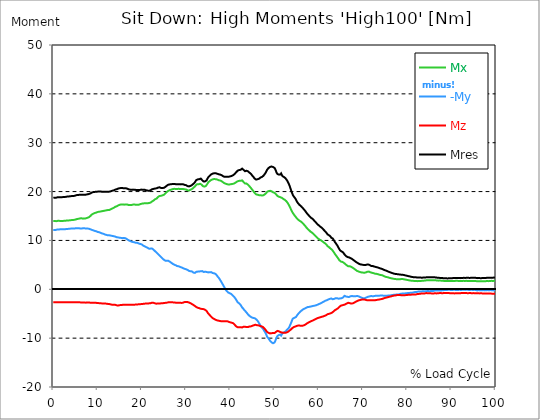
| Category |  Mx |  -My |  Mz |  Mres |
|---|---|---|---|---|
| 0.0 | 13.964 | 12.114 | -2.674 | 18.715 |
| 0.167348456675344 | 13.964 | 12.114 | -2.653 | 18.736 |
| 0.334696913350688 | 13.964 | 12.114 | -2.674 | 18.736 |
| 0.5020453700260321 | 13.964 | 12.134 | -2.674 | 18.736 |
| 0.669393826701376 | 13.944 | 12.175 | -2.674 | 18.756 |
| 0.83674228337672 | 13.964 | 12.216 | -2.674 | 18.798 |
| 1.0040907400520642 | 14.006 | 12.257 | -2.674 | 18.859 |
| 1.1621420602454444 | 14.026 | 12.257 | -2.674 | 18.859 |
| 1.3294905169207885 | 14.006 | 12.257 | -2.674 | 18.859 |
| 1.4968389735961325 | 14.006 | 12.257 | -2.674 | 18.859 |
| 1.6641874302714765 | 13.985 | 12.278 | -2.674 | 18.859 |
| 1.8315358869468206 | 13.985 | 12.278 | -2.653 | 18.859 |
| 1.9988843436221646 | 13.985 | 12.278 | -2.653 | 18.859 |
| 2.1662328002975086 | 14.006 | 12.278 | -2.674 | 18.88 |
| 2.333581256972853 | 14.006 | 12.299 | -2.653 | 18.88 |
| 2.5009297136481967 | 14.026 | 12.278 | -2.653 | 18.88 |
| 2.6682781703235405 | 14.026 | 12.299 | -2.653 | 18.9 |
| 2.8356266269988843 | 14.047 | 12.34 | -2.653 | 18.942 |
| 3.002975083674229 | 14.067 | 12.34 | -2.653 | 18.962 |
| 3.1703235403495724 | 14.088 | 12.34 | -2.653 | 18.962 |
| 3.337671997024917 | 14.088 | 12.36 | -2.653 | 18.983 |
| 3.4957233172182973 | 14.108 | 12.381 | -2.653 | 19.003 |
| 3.663071773893641 | 14.108 | 12.401 | -2.653 | 19.024 |
| 3.8304202305689854 | 14.129 | 12.401 | -2.653 | 19.044 |
| 3.997768687244329 | 14.15 | 12.422 | -2.653 | 19.065 |
| 4.165117143919673 | 14.191 | 12.401 | -2.653 | 19.085 |
| 4.332465600595017 | 14.191 | 12.422 | -2.653 | 19.085 |
| 4.499814057270361 | 14.191 | 12.422 | -2.653 | 19.106 |
| 4.667162513945706 | 14.211 | 12.422 | -2.674 | 19.106 |
| 4.834510970621049 | 14.232 | 12.443 | -2.674 | 19.147 |
| 5.001859427296393 | 14.273 | 12.484 | -2.674 | 19.188 |
| 5.169207883971737 | 14.335 | 12.504 | -2.674 | 19.25 |
| 5.336556340647081 | 14.376 | 12.484 | -2.674 | 19.291 |
| 5.503904797322425 | 14.417 | 12.463 | -2.674 | 19.291 |
| 5.671253253997769 | 14.438 | 12.484 | -2.674 | 19.312 |
| 5.82930457419115 | 14.479 | 12.484 | -2.653 | 19.332 |
| 5.996653030866494 | 14.499 | 12.463 | -2.674 | 19.353 |
| 6.164001487541838 | 14.54 | 12.443 | -2.674 | 19.353 |
| 6.331349944217181 | 14.54 | 12.422 | -2.694 | 19.353 |
| 6.498698400892526 | 14.52 | 12.443 | -2.694 | 19.353 |
| 6.66604685756787 | 14.458 | 12.484 | -2.694 | 19.353 |
| 6.833395314243213 | 14.458 | 12.525 | -2.694 | 19.373 |
| 7.000743770918558 | 14.479 | 12.484 | -2.715 | 19.353 |
| 7.168092227593902 | 14.499 | 12.443 | -2.735 | 19.353 |
| 7.335440684269246 | 14.52 | 12.443 | -2.735 | 19.373 |
| 7.50278914094459 | 14.561 | 12.463 | -2.715 | 19.415 |
| 7.6701375976199335 | 14.623 | 12.443 | -2.715 | 19.435 |
| 7.837486054295278 | 14.664 | 12.422 | -2.715 | 19.456 |
| 7.995537374488658 | 14.725 | 12.401 | -2.715 | 19.497 |
| 8.162885831164003 | 14.828 | 12.36 | -2.735 | 19.538 |
| 8.330234287839346 | 14.972 | 12.299 | -2.735 | 19.6 |
| 8.49758274451469 | 15.157 | 12.216 | -2.756 | 19.702 |
| 8.664931201190035 | 15.281 | 12.175 | -2.756 | 19.785 |
| 8.832279657865378 | 15.342 | 12.134 | -2.756 | 19.826 |
| 8.999628114540721 | 15.466 | 12.072 | -2.756 | 19.888 |
| 9.166976571216066 | 15.569 | 11.99 | -2.776 | 19.908 |
| 9.334325027891412 | 15.61 | 11.949 | -2.776 | 19.929 |
| 9.501673484566755 | 15.651 | 11.928 | -2.776 | 19.949 |
| 9.669021941242098 | 15.692 | 11.887 | -2.776 | 19.97 |
| 9.836370397917442 | 15.774 | 11.784 | -2.818 | 19.99 |
| 10.003718854592787 | 15.815 | 11.743 | -2.818 | 19.99 |
| 10.17106731126813 | 15.857 | 11.723 | -2.838 | 20.011 |
| 10.329118631461512 | 15.877 | 11.682 | -2.838 | 20.032 |
| 10.496467088136853 | 15.918 | 11.599 | -2.859 | 20.011 |
| 10.663815544812199 | 15.918 | 11.558 | -2.859 | 20.011 |
| 10.831164001487544 | 15.939 | 11.497 | -2.879 | 19.99 |
| 10.998512458162887 | 15.98 | 11.435 | -2.9 | 19.97 |
| 11.16586091483823 | 16.001 | 11.394 | -2.9 | 19.97 |
| 11.333209371513574 | 16.042 | 11.353 | -2.9 | 19.97 |
| 11.50055782818892 | 16.083 | 11.291 | -2.9 | 19.97 |
| 11.667906284864264 | 16.103 | 11.209 | -2.92 | 19.949 |
| 11.835254741539607 | 16.124 | 11.167 | -2.92 | 19.949 |
| 12.00260319821495 | 16.165 | 11.126 | -2.941 | 19.949 |
| 12.169951654890292 | 16.165 | 11.106 | -2.962 | 19.949 |
| 12.337300111565641 | 16.227 | 11.044 | -3.003 | 19.97 |
| 12.504648568240984 | 16.206 | 11.065 | -3.003 | 19.97 |
| 12.662699888434362 | 16.247 | 11.044 | -3.023 | 19.99 |
| 12.830048345109708 | 16.309 | 10.982 | -3.064 | 20.011 |
| 12.997396801785053 | 16.391 | 10.982 | -3.106 | 20.073 |
| 13.164745258460396 | 16.494 | 10.921 | -3.167 | 20.134 |
| 13.33209371513574 | 16.535 | 10.921 | -3.167 | 20.176 |
| 13.499442171811083 | 16.576 | 10.9 | -3.188 | 20.196 |
| 13.666790628486426 | 16.679 | 10.859 | -3.188 | 20.258 |
| 13.834139085161771 | 16.782 | 10.859 | -3.167 | 20.361 |
| 14.001487541837117 | 16.885 | 10.777 | -3.188 | 20.402 |
| 14.16883599851246 | 16.947 | 10.694 | -3.249 | 20.443 |
| 14.336184455187803 | 16.988 | 10.653 | -3.291 | 20.484 |
| 14.503532911863147 | 17.07 | 10.633 | -3.311 | 20.546 |
| 14.670881368538492 | 17.173 | 10.612 | -3.311 | 20.628 |
| 14.828932688731873 | 17.235 | 10.571 | -3.27 | 20.669 |
| 14.996281145407215 | 17.296 | 10.55 | -3.249 | 20.69 |
| 15.163629602082558 | 17.337 | 10.55 | -3.208 | 20.731 |
| 15.330978058757903 | 17.378 | 10.509 | -3.208 | 20.731 |
| 15.498326515433247 | 17.378 | 10.489 | -3.208 | 20.71 |
| 15.665674972108594 | 17.378 | 10.468 | -3.188 | 20.71 |
| 15.833023428783937 | 17.358 | 10.468 | -3.167 | 20.69 |
| 16.00037188545928 | 17.317 | 10.489 | -3.147 | 20.669 |
| 16.167720342134626 | 17.317 | 10.468 | -3.147 | 20.669 |
| 16.335068798809967 | 17.378 | 10.448 | -3.167 | 20.69 |
| 16.502417255485312 | 17.378 | 10.345 | -3.167 | 20.649 |
| 16.669765712160658 | 17.358 | 10.242 | -3.167 | 20.607 |
| 16.837114168836 | 17.296 | 10.119 | -3.167 | 20.525 |
| 17.004462625511344 | 17.255 | 10.036 | -3.167 | 20.463 |
| 17.16251394570472 | 17.214 | 9.934 | -3.167 | 20.402 |
| 17.32986240238007 | 17.235 | 9.892 | -3.147 | 20.402 |
| 17.497210859055414 | 17.255 | 9.81 | -3.147 | 20.381 |
| 17.664559315730756 | 17.255 | 9.748 | -3.147 | 20.361 |
| 17.8319077724061 | 17.317 | 9.687 | -3.147 | 20.381 |
| 17.999256229081443 | 17.337 | 9.666 | -3.147 | 20.402 |
| 18.166604685756788 | 17.337 | 9.625 | -3.147 | 20.402 |
| 18.333953142432133 | 17.337 | 9.625 | -3.147 | 20.381 |
| 18.501301599107478 | 17.317 | 9.584 | -3.126 | 20.361 |
| 18.668650055782823 | 17.317 | 9.502 | -3.126 | 20.34 |
| 18.835998512458165 | 17.296 | 9.502 | -3.126 | 20.319 |
| 19.00334696913351 | 17.296 | 9.502 | -3.106 | 20.299 |
| 19.170695425808855 | 17.276 | 9.481 | -3.085 | 20.278 |
| 19.338043882484197 | 17.317 | 9.358 | -3.064 | 20.299 |
| 19.496095202677576 | 17.378 | 9.296 | -3.044 | 20.319 |
| 19.66344365935292 | 17.44 | 9.275 | -3.044 | 20.361 |
| 19.830792116028263 | 17.481 | 9.255 | -3.044 | 20.381 |
| 19.998140572703612 | 17.522 | 9.173 | -3.023 | 20.402 |
| 20.165489029378953 | 17.543 | 9.07 | -3.003 | 20.381 |
| 20.3328374860543 | 17.564 | 8.926 | -2.982 | 20.361 |
| 20.500185942729644 | 17.605 | 8.843 | -2.982 | 20.361 |
| 20.667534399404985 | 17.625 | 8.782 | -2.941 | 20.361 |
| 20.83488285608033 | 17.584 | 8.72 | -2.92 | 20.299 |
| 21.002231312755672 | 17.605 | 8.617 | -2.9 | 20.258 |
| 21.16957976943102 | 17.584 | 8.556 | -2.9 | 20.217 |
| 21.336928226106362 | 17.605 | 8.473 | -2.9 | 20.196 |
| 21.504276682781704 | 17.646 | 8.37 | -2.9 | 20.176 |
| 21.67162513945705 | 17.666 | 8.288 | -2.879 | 20.176 |
| 21.82967645965043 | 17.708 | 8.206 | -2.879 | 20.176 |
| 21.997024916325774 | 17.749 | 8.329 | -2.838 | 20.278 |
| 22.16437337300112 | 17.872 | 8.391 | -2.776 | 20.402 |
| 22.33172182967646 | 17.995 | 8.329 | -2.735 | 20.484 |
| 22.499070286351806 | 18.078 | 8.227 | -2.735 | 20.505 |
| 22.666418743027148 | 18.181 | 8.083 | -2.776 | 20.546 |
| 22.833767199702496 | 18.304 | 7.939 | -2.838 | 20.587 |
| 23.00111565637784 | 18.427 | 7.795 | -2.879 | 20.628 |
| 23.168464113053183 | 18.489 | 7.651 | -2.92 | 20.649 |
| 23.335812569728528 | 18.571 | 7.527 | -2.941 | 20.669 |
| 23.50316102640387 | 18.695 | 7.383 | -2.92 | 20.71 |
| 23.670509483079215 | 18.88 | 7.219 | -2.92 | 20.813 |
| 23.83785793975456 | 19.044 | 7.075 | -2.92 | 20.875 |
| 23.995909259947936 | 19.106 | 6.931 | -2.9 | 20.875 |
| 24.163257716623285 | 19.106 | 6.787 | -2.879 | 20.813 |
| 24.330606173298627 | 19.127 | 6.602 | -2.879 | 20.751 |
| 24.49795462997397 | 19.188 | 6.458 | -2.859 | 20.751 |
| 24.665303086649313 | 19.229 | 6.293 | -2.859 | 20.731 |
| 24.83265154332466 | 19.291 | 6.17 | -2.838 | 20.731 |
| 25.0 | 19.353 | 6.046 | -2.818 | 20.772 |
| 25.167348456675345 | 19.476 | 5.944 | -2.797 | 20.854 |
| 25.334696913350694 | 19.62 | 5.841 | -2.776 | 20.957 |
| 25.502045370026035 | 19.764 | 5.759 | -2.776 | 21.08 |
| 25.669393826701377 | 19.929 | 5.82 | -2.735 | 21.224 |
| 25.836742283376722 | 20.052 | 5.82 | -2.715 | 21.327 |
| 26.004090740052067 | 20.155 | 5.82 | -2.674 | 21.409 |
| 26.17143919672741 | 20.237 | 5.779 | -2.653 | 21.471 |
| 26.329490516920792 | 20.299 | 5.656 | -2.653 | 21.471 |
| 26.49683897359613 | 20.34 | 5.491 | -2.653 | 21.492 |
| 26.66418743027148 | 20.402 | 5.429 | -2.653 | 21.512 |
| 26.831535886946828 | 20.463 | 5.306 | -2.653 | 21.533 |
| 26.998884343622166 | 20.505 | 5.203 | -2.674 | 21.553 |
| 27.166232800297514 | 20.525 | 5.121 | -2.694 | 21.553 |
| 27.333581256972852 | 20.566 | 5.039 | -2.715 | 21.574 |
| 27.5009297136482 | 20.546 | 4.977 | -2.735 | 21.533 |
| 27.668278170323543 | 20.525 | 4.915 | -2.735 | 21.512 |
| 27.835626626998888 | 20.505 | 4.792 | -2.735 | 21.471 |
| 28.002975083674233 | 20.525 | 4.751 | -2.756 | 21.492 |
| 28.170323540349575 | 20.525 | 4.71 | -2.756 | 21.492 |
| 28.33767199702492 | 20.566 | 4.71 | -2.735 | 21.512 |
| 28.50502045370026 | 20.566 | 4.648 | -2.735 | 21.512 |
| 28.663071773893645 | 20.505 | 4.566 | -2.735 | 21.471 |
| 28.830420230568986 | 20.505 | 4.504 | -2.776 | 21.471 |
| 28.99776868724433 | 20.525 | 4.463 | -2.797 | 21.492 |
| 29.165117143919673 | 20.525 | 4.381 | -2.776 | 21.492 |
| 29.33246560059502 | 20.525 | 4.319 | -2.735 | 21.492 |
| 29.499814057270367 | 20.505 | 4.237 | -2.674 | 21.43 |
| 29.66716251394571 | 20.463 | 4.196 | -2.612 | 21.368 |
| 29.834510970621054 | 20.463 | 4.154 | -2.591 | 21.368 |
| 30.00185942729639 | 20.422 | 4.093 | -2.591 | 21.307 |
| 30.169207883971744 | 20.34 | 4.031 | -2.612 | 21.224 |
| 30.33655634064708 | 20.258 | 3.969 | -2.612 | 21.122 |
| 30.50390479732243 | 20.258 | 3.825 | -2.674 | 21.101 |
| 30.671253253997772 | 20.217 | 3.764 | -2.715 | 21.06 |
| 30.829304574191156 | 20.258 | 3.702 | -2.776 | 21.08 |
| 30.996653030866494 | 20.361 | 3.681 | -2.838 | 21.163 |
| 31.164001487541842 | 20.402 | 3.722 | -2.941 | 21.204 |
| 31.331349944217187 | 20.505 | 3.661 | -3.023 | 21.327 |
| 31.498698400892525 | 20.649 | 3.579 | -3.106 | 21.471 |
| 31.666046857567874 | 20.772 | 3.414 | -3.208 | 21.595 |
| 31.833395314243212 | 20.895 | 3.311 | -3.311 | 21.739 |
| 32.00074377091856 | 21.039 | 3.352 | -3.414 | 21.903 |
| 32.1680922275939 | 21.245 | 3.476 | -3.517 | 22.15 |
| 32.33544068426925 | 21.43 | 3.579 | -3.64 | 22.376 |
| 32.50278914094459 | 21.512 | 3.579 | -3.722 | 22.458 |
| 32.670137597619934 | 21.533 | 3.62 | -3.784 | 22.499 |
| 32.83748605429528 | 21.492 | 3.661 | -3.825 | 22.479 |
| 33.004834510970625 | 21.533 | 3.64 | -3.866 | 22.541 |
| 33.162885831164004 | 21.595 | 3.62 | -3.928 | 22.623 |
| 33.33023428783935 | 21.615 | 3.702 | -3.99 | 22.664 |
| 33.497582744514695 | 21.43 | 3.722 | -4.01 | 22.499 |
| 33.664931201190036 | 21.245 | 3.722 | -4.031 | 22.314 |
| 33.83227965786538 | 21.101 | 3.661 | -4.031 | 22.15 |
| 33.99962811454073 | 21.019 | 3.537 | -4.072 | 22.047 |
| 34.16697657121607 | 21.019 | 3.496 | -4.134 | 22.026 |
| 34.33432502789141 | 21.08 | 3.599 | -4.216 | 22.088 |
| 34.50167348456676 | 21.163 | 3.62 | -4.319 | 22.17 |
| 34.6690219412421 | 21.307 | 3.537 | -4.463 | 22.314 |
| 34.83637039791744 | 21.595 | 3.476 | -4.71 | 22.623 |
| 35.00371885459279 | 21.883 | 3.455 | -4.936 | 22.911 |
| 35.17106731126814 | 22.026 | 3.476 | -5.1 | 23.096 |
| 35.338415767943474 | 22.129 | 3.496 | -5.265 | 23.219 |
| 35.49646708813686 | 22.232 | 3.496 | -5.429 | 23.343 |
| 35.6638155448122 | 22.356 | 3.517 | -5.594 | 23.507 |
| 35.831164001487544 | 22.458 | 3.414 | -5.759 | 23.61 |
| 35.998512458162885 | 22.499 | 3.332 | -5.882 | 23.672 |
| 36.165860914838234 | 22.561 | 3.311 | -5.985 | 23.733 |
| 36.333209371513576 | 22.561 | 3.27 | -6.067 | 23.754 |
| 36.50055782818892 | 22.561 | 3.249 | -6.149 | 23.775 |
| 36.667906284864266 | 22.541 | 3.147 | -6.232 | 23.754 |
| 36.83525474153961 | 22.52 | 3.003 | -6.314 | 23.733 |
| 37.002603198214956 | 22.479 | 2.797 | -6.355 | 23.672 |
| 37.1699516548903 | 22.397 | 2.591 | -6.396 | 23.59 |
| 37.337300111565646 | 22.335 | 2.427 | -6.417 | 23.548 |
| 37.50464856824098 | 22.314 | 2.221 | -6.458 | 23.507 |
| 37.66269988843437 | 22.273 | 1.974 | -6.499 | 23.487 |
| 37.83004834510971 | 22.232 | 1.728 | -6.52 | 23.446 |
| 37.99739680178505 | 22.15 | 1.481 | -6.54 | 23.384 |
| 38.16474525846039 | 22.068 | 1.213 | -6.54 | 23.302 |
| 38.33209371513574 | 21.924 | 0.946 | -6.54 | 23.178 |
| 38.49944217181109 | 21.8 | 0.679 | -6.54 | 23.075 |
| 38.666790628486424 | 21.718 | 0.411 | -6.561 | 23.014 |
| 38.83413908516178 | 21.656 | 0.144 | -6.54 | 23.014 |
| 39.001487541837115 | 21.595 | -0.123 | -6.52 | 23.014 |
| 39.16883599851246 | 21.533 | -0.329 | -6.52 | 23.014 |
| 39.336184455187805 | 21.492 | -0.514 | -6.54 | 23.014 |
| 39.503532911863154 | 21.43 | -0.638 | -6.581 | 23.014 |
| 39.670881368538495 | 21.43 | -0.74 | -6.663 | 23.034 |
| 39.83822982521384 | 21.451 | -0.802 | -6.725 | 23.075 |
| 39.996281145407224 | 21.492 | -0.843 | -6.766 | 23.116 |
| 40.163629602082565 | 21.512 | -0.925 | -6.807 | 23.158 |
| 40.33097805875791 | 21.533 | -1.049 | -6.849 | 23.199 |
| 40.498326515433256 | 21.574 | -1.213 | -6.951 | 23.281 |
| 40.6656749721086 | 21.595 | -1.357 | -6.951 | 23.363 |
| 40.83302342878393 | 21.656 | -1.501 | -7.095 | 23.487 |
| 41.00037188545929 | 21.718 | -1.645 | -7.26 | 23.61 |
| 41.16772034213463 | 21.8 | -1.892 | -7.424 | 23.775 |
| 41.33506879880997 | 21.924 | -2.159 | -7.589 | 23.96 |
| 41.50241725548531 | 22.047 | -2.386 | -7.733 | 24.145 |
| 41.66976571216066 | 22.109 | -2.653 | -7.774 | 24.268 |
| 41.837114168836 | 22.17 | -2.776 | -7.774 | 24.35 |
| 42.004462625511344 | 22.191 | -2.879 | -7.774 | 24.412 |
| 42.17181108218669 | 22.191 | -3.023 | -7.753 | 24.412 |
| 42.32986240238007 | 22.191 | -3.188 | -7.753 | 24.453 |
| 42.497210859055414 | 22.273 | -3.455 | -7.795 | 24.597 |
| 42.66455931573076 | 22.294 | -3.702 | -7.815 | 24.7 |
| 42.831907772406105 | 22.109 | -3.846 | -7.692 | 24.577 |
| 42.999256229081446 | 21.965 | -4.031 | -7.651 | 24.453 |
| 43.16660468575679 | 21.821 | -4.257 | -7.651 | 24.309 |
| 43.33395314243214 | 21.656 | -4.442 | -7.671 | 24.165 |
| 43.50130159910748 | 21.656 | -4.566 | -7.712 | 24.227 |
| 43.66865005578282 | 21.636 | -4.73 | -7.733 | 24.268 |
| 43.83599851245817 | 21.533 | -4.936 | -7.733 | 24.227 |
| 44.00334696913351 | 21.409 | -5.142 | -7.733 | 24.145 |
| 44.17069542580886 | 21.286 | -5.306 | -7.671 | 24.042 |
| 44.3380438824842 | 21.08 | -5.429 | -7.61 | 23.877 |
| 44.49609520267758 | 20.916 | -5.573 | -7.589 | 23.775 |
| 44.66344365935292 | 20.751 | -5.656 | -7.589 | 23.631 |
| 44.83079211602827 | 20.525 | -5.8 | -7.548 | 23.446 |
| 44.99814057270361 | 20.34 | -5.82 | -7.466 | 23.24 |
| 45.16548902937895 | 20.155 | -5.861 | -7.404 | 23.075 |
| 45.332837486054295 | 19.97 | -5.882 | -7.363 | 22.89 |
| 45.500185942729644 | 19.723 | -5.903 | -7.28 | 22.664 |
| 45.66753439940499 | 19.538 | -5.985 | -7.26 | 22.499 |
| 45.83488285608033 | 19.435 | -6.129 | -7.28 | 22.458 |
| 46.00223131275568 | 19.373 | -6.273 | -7.342 | 22.479 |
| 46.16957976943102 | 19.353 | -6.437 | -7.383 | 22.52 |
| 46.336928226106366 | 19.291 | -6.643 | -7.383 | 22.541 |
| 46.50427668278171 | 19.271 | -6.931 | -7.383 | 22.623 |
| 46.671625139457056 | 19.271 | -7.157 | -7.486 | 22.746 |
| 46.829676459650436 | 19.271 | -7.445 | -7.527 | 22.87 |
| 46.99702491632577 | 19.25 | -7.712 | -7.568 | 22.993 |
| 47.16437337300112 | 19.188 | -7.856 | -7.589 | 22.993 |
| 47.33172182967646 | 19.209 | -8.021 | -7.692 | 23.096 |
| 47.49907028635181 | 19.25 | -8.227 | -7.836 | 23.24 |
| 47.66641874302716 | 19.332 | -8.494 | -7.98 | 23.425 |
| 47.83376719970249 | 19.456 | -8.7 | -8.144 | 23.631 |
| 48.001115656377834 | 19.579 | -9.008 | -8.309 | 23.857 |
| 48.16846411305319 | 19.723 | -9.337 | -8.535 | 24.145 |
| 48.33581256972853 | 19.949 | -9.707 | -8.741 | 24.494 |
| 48.50316102640387 | 20.011 | -9.81 | -8.843 | 24.659 |
| 48.67050948307921 | 20.093 | -10.077 | -8.926 | 24.823 |
| 48.837857939754564 | 20.155 | -10.324 | -8.987 | 24.947 |
| 49.005206396429905 | 20.155 | -10.55 | -9.029 | 25.05 |
| 49.163257716623285 | 20.134 | -10.715 | -9.029 | 25.111 |
| 49.33060617329863 | 20.073 | -10.859 | -9.008 | 25.132 |
| 49.49795462997397 | 19.97 | -10.982 | -8.967 | 25.091 |
| 49.66530308664932 | 19.867 | -11.044 | -8.926 | 25.029 |
| 49.832651543324666 | 19.785 | -11.003 | -8.946 | 24.947 |
| 50.0 | 19.744 | -10.9 | -8.967 | 24.844 |
| 50.16734845667534 | 19.641 | -10.592 | -8.843 | 24.577 |
| 50.33469691335069 | 19.456 | -10.201 | -8.72 | 24.206 |
| 50.50204537002604 | 19.271 | -9.831 | -8.597 | 23.816 |
| 50.66939382670139 | 19.106 | -9.563 | -8.514 | 23.61 |
| 50.836742283376715 | 19.024 | -9.46 | -8.556 | 23.548 |
| 51.00409074005207 | 18.942 | -9.358 | -8.597 | 23.466 |
| 51.17143919672741 | 18.839 | -9.255 | -8.658 | 23.404 |
| 51.32949051692079 | 18.839 | -9.275 | -8.761 | 23.487 |
| 51.496838973596134 | 18.942 | -9.481 | -8.905 | 23.713 |
| 51.66418743027148 | 18.715 | -9.214 | -8.864 | 23.384 |
| 51.831535886946824 | 18.551 | -8.967 | -8.843 | 23.137 |
| 51.99888434362217 | 18.489 | -8.885 | -8.885 | 23.034 |
| 52.16623280029752 | 18.448 | -8.802 | -8.905 | 22.973 |
| 52.33358125697285 | 18.304 | -8.72 | -8.905 | 22.849 |
| 52.5009297136482 | 18.181 | -8.638 | -8.885 | 22.705 |
| 52.668278170323546 | 18.037 | -8.494 | -8.864 | 22.541 |
| 52.835626626998895 | 17.852 | -8.288 | -8.802 | 22.294 |
| 53.00297508367424 | 17.646 | -8.124 | -8.741 | 22.026 |
| 53.17032354034958 | 17.378 | -7.98 | -8.617 | 21.718 |
| 53.33767199702492 | 17.091 | -7.753 | -8.494 | 21.368 |
| 53.50502045370027 | 16.803 | -7.383 | -8.37 | 20.957 |
| 53.663071773893655 | 16.474 | -7.054 | -8.268 | 20.505 |
| 53.83042023056899 | 16.145 | -6.684 | -8.124 | 20.032 |
| 53.99776868724433 | 15.857 | -6.273 | -7.959 | 19.641 |
| 54.16511714391967 | 15.589 | -5.985 | -7.836 | 19.291 |
| 54.33246560059503 | 15.363 | -5.882 | -7.753 | 19.024 |
| 54.49981405727037 | 15.157 | -5.841 | -7.692 | 18.839 |
| 54.667162513945705 | 14.972 | -5.759 | -7.63 | 18.633 |
| 54.834510970621054 | 14.787 | -5.697 | -7.548 | 18.386 |
| 55.0018594272964 | 14.581 | -5.491 | -7.507 | 18.078 |
| 55.169207883971744 | 14.396 | -5.244 | -7.445 | 17.81 |
| 55.336556340647086 | 14.252 | -5.059 | -7.424 | 17.605 |
| 55.50390479732243 | 14.15 | -4.895 | -7.424 | 17.44 |
| 55.671253253997776 | 14.026 | -4.71 | -7.424 | 17.255 |
| 55.83860171067312 | 13.923 | -4.566 | -7.445 | 17.111 |
| 55.9966530308665 | 13.841 | -4.442 | -7.486 | 17.008 |
| 56.16400148754184 | 13.718 | -4.319 | -7.507 | 16.864 |
| 56.33134994421718 | 13.574 | -4.216 | -7.466 | 16.7 |
| 56.498698400892536 | 13.43 | -4.093 | -7.424 | 16.515 |
| 56.66604685756788 | 13.245 | -3.99 | -7.363 | 16.33 |
| 56.83339531424321 | 13.08 | -3.949 | -7.301 | 16.145 |
| 57.00074377091856 | 12.895 | -3.908 | -7.219 | 15.98 |
| 57.16809222759391 | 12.689 | -3.784 | -7.095 | 15.754 |
| 57.33544068426925 | 12.525 | -3.702 | -6.993 | 15.548 |
| 57.5027891409446 | 12.36 | -3.64 | -6.91 | 15.363 |
| 57.670137597619934 | 12.216 | -3.599 | -6.807 | 15.198 |
| 57.83748605429528 | 12.072 | -3.599 | -6.746 | 15.055 |
| 58.004834510970625 | 11.908 | -3.599 | -6.663 | 14.869 |
| 58.16288583116401 | 11.784 | -3.537 | -6.581 | 14.705 |
| 58.330234287839346 | 11.661 | -3.496 | -6.499 | 14.581 |
| 58.497582744514695 | 11.579 | -3.455 | -6.437 | 14.479 |
| 58.66493120119004 | 11.476 | -3.455 | -6.396 | 14.376 |
| 58.832279657865385 | 11.311 | -3.393 | -6.314 | 14.191 |
| 58.999628114540734 | 11.147 | -3.352 | -6.232 | 14.026 |
| 59.16697657121607 | 11.003 | -3.332 | -6.149 | 13.862 |
| 59.33432502789142 | 10.88 | -3.311 | -6.088 | 13.718 |
| 59.50167348456676 | 10.694 | -3.249 | -6.005 | 13.533 |
| 59.66902194124211 | 10.509 | -3.188 | -5.923 | 13.348 |
| 59.83637039791745 | 10.386 | -3.106 | -5.861 | 13.204 |
| 60.00371885459278 | 10.304 | -3.044 | -5.82 | 13.101 |
| 60.17106731126813 | 10.18 | -2.982 | -5.779 | 12.957 |
| 60.33841576794349 | 10.098 | -2.9 | -5.738 | 12.833 |
| 60.49646708813685 | 10.016 | -2.838 | -5.676 | 12.731 |
| 60.6638155448122 | 9.934 | -2.756 | -5.635 | 12.607 |
| 60.831164001487544 | 9.81 | -2.674 | -5.594 | 12.443 |
| 60.99851245816289 | 9.687 | -2.591 | -5.553 | 12.299 |
| 61.16586091483824 | 9.563 | -2.509 | -5.491 | 12.134 |
| 61.333209371513576 | 9.44 | -2.406 | -5.429 | 11.97 |
| 61.50055782818892 | 9.358 | -2.345 | -5.388 | 11.867 |
| 61.667906284864266 | 9.193 | -2.283 | -5.306 | 11.661 |
| 61.835254741539615 | 9.049 | -2.242 | -5.244 | 11.517 |
| 62.002603198214956 | 8.823 | -2.139 | -5.1 | 11.229 |
| 62.16995165489029 | 8.679 | -2.077 | -5.039 | 11.106 |
| 62.33730011156564 | 8.617 | -1.995 | -5.018 | 11.065 |
| 62.504648568240995 | 8.494 | -1.974 | -4.977 | 10.962 |
| 62.67199702491633 | 8.329 | -1.933 | -4.915 | 10.797 |
| 62.83004834510971 | 8.144 | -1.872 | -4.813 | 10.55 |
| 62.99739680178505 | 8.103 | -1.954 | -4.792 | 10.53 |
| 63.1647452584604 | 7.918 | -2.036 | -4.689 | 10.386 |
| 63.33209371513575 | 7.692 | -1.995 | -4.545 | 10.16 |
| 63.4994421718111 | 7.466 | -1.954 | -4.401 | 9.913 |
| 63.666790628486424 | 7.219 | -1.892 | -4.278 | 9.666 |
| 63.83413908516177 | 7.054 | -1.83 | -4.196 | 9.481 |
| 64.00148754183712 | 6.828 | -1.81 | -4.093 | 9.234 |
| 64.16883599851248 | 6.602 | -1.83 | -4.01 | 9.029 |
| 64.3361844551878 | 6.396 | -1.913 | -3.908 | 8.761 |
| 64.50353291186315 | 6.17 | -1.933 | -3.764 | 8.473 |
| 64.6708813685385 | 5.944 | -1.913 | -3.599 | 8.206 |
| 64.83822982521384 | 5.779 | -1.872 | -3.435 | 7.959 |
| 65.00557828188919 | 5.676 | -1.851 | -3.352 | 7.836 |
| 65.16362960208257 | 5.615 | -1.83 | -3.291 | 7.753 |
| 65.3309780587579 | 5.615 | -1.81 | -3.27 | 7.692 |
| 65.49832651543326 | 5.532 | -1.686 | -3.229 | 7.548 |
| 65.6656749721086 | 5.429 | -1.522 | -3.188 | 7.342 |
| 65.83302342878395 | 5.347 | -1.337 | -3.167 | 7.136 |
| 66.00037188545929 | 5.162 | -1.419 | -3.085 | 6.972 |
| 66.16772034213463 | 5.018 | -1.481 | -2.982 | 6.807 |
| 66.33506879880998 | 4.915 | -1.522 | -2.9 | 6.725 |
| 66.50241725548531 | 4.813 | -1.542 | -2.818 | 6.602 |
| 66.66976571216065 | 4.71 | -1.522 | -2.756 | 6.458 |
| 66.83711416883601 | 4.751 | -1.584 | -2.797 | 6.54 |
| 67.00446262551135 | 4.71 | -1.481 | -2.838 | 6.437 |
| 67.1718110821867 | 4.669 | -1.44 | -2.9 | 6.396 |
| 67.32986240238007 | 4.607 | -1.399 | -2.92 | 6.334 |
| 67.49721085905541 | 4.525 | -1.378 | -2.92 | 6.232 |
| 67.66455931573076 | 4.422 | -1.378 | -2.879 | 6.129 |
| 67.83190777240611 | 4.319 | -1.419 | -2.818 | 6.005 |
| 67.99925622908145 | 4.216 | -1.419 | -2.756 | 5.903 |
| 68.16660468575678 | 4.093 | -1.419 | -2.674 | 5.779 |
| 68.33395314243214 | 3.99 | -1.419 | -2.571 | 5.656 |
| 68.50130159910749 | 3.866 | -1.399 | -2.489 | 5.553 |
| 68.66865005578282 | 3.764 | -1.399 | -2.406 | 5.45 |
| 68.83599851245816 | 3.702 | -1.399 | -2.345 | 5.368 |
| 69.00334696913352 | 3.64 | -1.419 | -2.283 | 5.286 |
| 69.17069542580886 | 3.579 | -1.501 | -2.242 | 5.183 |
| 69.3380438824842 | 3.537 | -1.563 | -2.201 | 5.142 |
| 69.50539233915956 | 3.476 | -1.645 | -2.159 | 5.08 |
| 69.66344365935292 | 3.455 | -1.707 | -2.118 | 5.039 |
| 69.83079211602826 | 3.435 | -1.769 | -2.098 | 5.039 |
| 69.99814057270362 | 3.414 | -1.83 | -2.077 | 5.018 |
| 70.16548902937896 | 3.373 | -1.872 | -2.077 | 4.977 |
| 70.33283748605429 | 3.393 | -1.83 | -2.098 | 4.977 |
| 70.50018594272964 | 3.414 | -1.789 | -2.118 | 4.956 |
| 70.667534399405 | 3.455 | -1.707 | -2.18 | 4.998 |
| 70.83488285608033 | 3.537 | -1.645 | -2.242 | 5.039 |
| 71.00223131275568 | 3.599 | -1.584 | -2.262 | 5.059 |
| 71.16957976943102 | 3.64 | -1.522 | -2.283 | 5.08 |
| 71.33692822610637 | 3.62 | -1.501 | -2.242 | 5.039 |
| 71.50427668278171 | 3.579 | -1.46 | -2.221 | 4.977 |
| 71.67162513945706 | 3.476 | -1.419 | -2.221 | 4.854 |
| 71.8389735961324 | 3.414 | -1.378 | -2.221 | 4.792 |
| 71.99702491632577 | 3.393 | -1.399 | -2.221 | 4.792 |
| 72.16437337300113 | 3.373 | -1.419 | -2.242 | 4.771 |
| 72.33172182967647 | 3.311 | -1.419 | -2.242 | 4.73 |
| 72.49907028635181 | 3.249 | -1.399 | -2.242 | 4.669 |
| 72.66641874302715 | 3.208 | -1.337 | -2.242 | 4.627 |
| 72.8337671997025 | 3.188 | -1.337 | -2.221 | 4.586 |
| 73.00111565637783 | 3.167 | -1.337 | -2.201 | 4.545 |
| 73.16846411305319 | 3.147 | -1.316 | -2.18 | 4.504 |
| 73.33581256972853 | 3.106 | -1.296 | -2.139 | 4.463 |
| 73.50316102640387 | 3.044 | -1.316 | -2.118 | 4.422 |
| 73.67050948307921 | 3.003 | -1.316 | -2.098 | 4.36 |
| 73.83785793975457 | 2.962 | -1.296 | -2.057 | 4.298 |
| 74.00520639642991 | 2.92 | -1.275 | -2.036 | 4.257 |
| 74.16325771662328 | 2.92 | -1.275 | -1.995 | 4.216 |
| 74.33060617329863 | 2.879 | -1.275 | -1.974 | 4.175 |
| 74.49795462997398 | 2.797 | -1.296 | -1.933 | 4.093 |
| 74.66530308664932 | 2.735 | -1.275 | -1.872 | 4.031 |
| 74.83265154332466 | 2.632 | -1.316 | -1.81 | 3.949 |
| 75.00000000000001 | 2.591 | -1.337 | -1.748 | 3.887 |
| 75.16734845667534 | 2.55 | -1.337 | -1.707 | 3.846 |
| 75.3346969133507 | 2.509 | -1.316 | -1.686 | 3.764 |
| 75.50204537002605 | 2.468 | -1.316 | -1.645 | 3.722 |
| 75.66939382670138 | 2.447 | -1.275 | -1.604 | 3.64 |
| 75.83674228337672 | 2.386 | -1.255 | -1.563 | 3.579 |
| 76.00409074005208 | 2.345 | -1.275 | -1.522 | 3.537 |
| 76.17143919672742 | 2.303 | -1.275 | -1.501 | 3.476 |
| 76.33878765340276 | 2.262 | -1.213 | -1.46 | 3.393 |
| 76.49683897359614 | 2.242 | -1.193 | -1.399 | 3.352 |
| 76.66418743027148 | 2.201 | -1.172 | -1.357 | 3.291 |
| 76.83153588694682 | 2.159 | -1.152 | -1.337 | 3.249 |
| 76.99888434362218 | 2.139 | -1.131 | -1.296 | 3.208 |
| 77.16623280029752 | 2.118 | -1.111 | -1.275 | 3.167 |
| 77.33358125697285 | 2.098 | -1.111 | -1.255 | 3.147 |
| 77.5009297136482 | 2.077 | -1.09 | -1.213 | 3.126 |
| 77.66827817032356 | 2.057 | -1.09 | -1.193 | 3.085 |
| 77.83562662699889 | 2.057 | -1.09 | -1.172 | 3.085 |
| 78.00297508367423 | 2.036 | -1.069 | -1.152 | 3.064 |
| 78.17032354034959 | 2.036 | -1.028 | -1.172 | 3.044 |
| 78.33767199702493 | 2.057 | -0.987 | -1.172 | 3.023 |
| 78.50502045370027 | 2.077 | -0.925 | -1.213 | 3.003 |
| 78.67236891037561 | 2.098 | -0.905 | -1.213 | 3.003 |
| 78.83042023056899 | 2.098 | -0.884 | -1.213 | 2.982 |
| 78.99776868724433 | 2.098 | -0.864 | -1.213 | 2.962 |
| 79.16511714391969 | 2.057 | -0.864 | -1.213 | 2.941 |
| 79.33246560059503 | 2.036 | -0.843 | -1.213 | 2.9 |
| 79.49981405727036 | 1.995 | -0.843 | -1.193 | 2.859 |
| 79.66716251394571 | 1.974 | -0.843 | -1.193 | 2.838 |
| 79.83451097062107 | 1.954 | -0.823 | -1.172 | 2.797 |
| 80.00185942729641 | 1.913 | -0.802 | -1.152 | 2.756 |
| 80.16920788397174 | 1.872 | -0.761 | -1.131 | 2.715 |
| 80.33655634064709 | 1.851 | -0.74 | -1.131 | 2.674 |
| 80.50390479732243 | 1.83 | -0.74 | -1.131 | 2.653 |
| 80.67125325399778 | 1.789 | -0.72 | -1.111 | 2.612 |
| 80.83860171067312 | 1.769 | -0.72 | -1.111 | 2.571 |
| 80.99665303086651 | 1.748 | -0.72 | -1.09 | 2.55 |
| 81.16400148754184 | 1.728 | -0.699 | -1.09 | 2.509 |
| 81.3313499442172 | 1.728 | -0.658 | -1.069 | 2.489 |
| 81.49869840089255 | 1.728 | -0.617 | -1.069 | 2.468 |
| 81.66604685756786 | 1.707 | -0.576 | -1.049 | 2.468 |
| 81.83339531424322 | 1.686 | -0.555 | -1.049 | 2.468 |
| 82.00074377091858 | 1.707 | -0.555 | -1.049 | 2.447 |
| 82.16809222759392 | 1.686 | -0.535 | -1.008 | 2.427 |
| 82.33544068426926 | 1.666 | -0.494 | -0.967 | 2.406 |
| 82.50278914094459 | 1.666 | -0.473 | -0.946 | 2.386 |
| 82.67013759761994 | 1.686 | -0.452 | -0.946 | 2.406 |
| 82.83748605429528 | 1.707 | -0.452 | -0.925 | 2.406 |
| 83.00483451097062 | 1.707 | -0.452 | -0.905 | 2.406 |
| 83.17218296764597 | 1.707 | -0.452 | -0.884 | 2.386 |
| 83.33023428783935 | 1.728 | -0.432 | -0.843 | 2.365 |
| 83.4975827445147 | 1.728 | -0.391 | -0.864 | 2.386 |
| 83.66493120119004 | 1.748 | -0.391 | -0.864 | 2.406 |
| 83.83227965786537 | 1.769 | -0.432 | -0.864 | 2.427 |
| 83.99962811454073 | 1.789 | -0.432 | -0.843 | 2.427 |
| 84.16697657121607 | 1.81 | -0.411 | -0.802 | 2.427 |
| 84.33432502789142 | 1.83 | -0.391 | -0.782 | 2.447 |
| 84.50167348456677 | 1.83 | -0.37 | -0.782 | 2.468 |
| 84.6690219412421 | 1.83 | -0.37 | -0.802 | 2.468 |
| 84.83637039791745 | 1.83 | -0.37 | -0.823 | 2.468 |
| 85.0037188545928 | 1.83 | -0.411 | -0.823 | 2.468 |
| 85.17106731126813 | 1.83 | -0.391 | -0.823 | 2.468 |
| 85.33841576794349 | 1.851 | -0.37 | -0.823 | 2.489 |
| 85.50576422461883 | 1.851 | -0.329 | -0.864 | 2.489 |
| 85.66381554481221 | 1.83 | -0.329 | -0.864 | 2.468 |
| 85.83116400148755 | 1.83 | -0.35 | -0.864 | 2.468 |
| 85.99851245816289 | 1.851 | -0.329 | -0.843 | 2.447 |
| 86.16586091483823 | 1.851 | -0.288 | -0.843 | 2.447 |
| 86.33320937151358 | 1.851 | -0.247 | -0.823 | 2.447 |
| 86.50055782818893 | 1.83 | -0.226 | -0.843 | 2.427 |
| 86.66790628486427 | 1.81 | -0.247 | -0.843 | 2.406 |
| 86.83525474153961 | 1.789 | -0.267 | -0.843 | 2.365 |
| 87.00260319821496 | 1.769 | -0.267 | -0.802 | 2.345 |
| 87.16995165489031 | 1.769 | -0.247 | -0.782 | 2.345 |
| 87.33730011156564 | 1.789 | -0.226 | -0.782 | 2.345 |
| 87.504648568241 | 1.769 | -0.226 | -0.782 | 2.324 |
| 87.67199702491634 | 1.769 | -0.226 | -0.782 | 2.324 |
| 87.83004834510972 | 1.769 | -0.226 | -0.802 | 2.324 |
| 87.99739680178506 | 1.748 | -0.206 | -0.802 | 2.303 |
| 88.1647452584604 | 1.728 | -0.206 | -0.782 | 2.262 |
| 88.33209371513574 | 1.707 | -0.206 | -0.761 | 2.242 |
| 88.49944217181108 | 1.707 | -0.144 | -0.761 | 2.242 |
| 88.66679062848644 | 1.707 | -0.123 | -0.761 | 2.262 |
| 88.83413908516178 | 1.707 | -0.123 | -0.782 | 2.242 |
| 89.00148754183712 | 1.686 | -0.165 | -0.761 | 2.242 |
| 89.16883599851246 | 1.686 | -0.123 | -0.74 | 2.221 |
| 89.33618445518782 | 1.686 | -0.103 | -0.761 | 2.242 |
| 89.50353291186315 | 1.707 | -0.082 | -0.782 | 2.262 |
| 89.6708813685385 | 1.707 | -0.103 | -0.802 | 2.262 |
| 89.83822982521386 | 1.728 | -0.144 | -0.823 | 2.283 |
| 90.00557828188919 | 1.707 | -0.165 | -0.802 | 2.262 |
| 90.16362960208257 | 1.686 | -0.165 | -0.802 | 2.262 |
| 90.3309780587579 | 1.686 | -0.123 | -0.802 | 2.283 |
| 90.49832651543326 | 1.707 | -0.103 | -0.823 | 2.324 |
| 90.66567497210859 | 1.707 | -0.123 | -0.843 | 2.324 |
| 90.83302342878395 | 1.728 | -0.123 | -0.843 | 2.324 |
| 91.00037188545929 | 1.728 | -0.123 | -0.823 | 2.324 |
| 91.16772034213463 | 1.728 | -0.144 | -0.823 | 2.324 |
| 91.33506879880998 | 1.728 | -0.165 | -0.802 | 2.324 |
| 91.50241725548533 | 1.707 | -0.144 | -0.802 | 2.303 |
| 91.66976571216065 | 1.707 | -0.103 | -0.802 | 2.324 |
| 91.83711416883601 | 1.686 | -0.103 | -0.802 | 2.303 |
| 92.00446262551137 | 1.686 | -0.123 | -0.802 | 2.283 |
| 92.1718110821867 | 1.686 | -0.144 | -0.782 | 2.283 |
| 92.33915953886203 | 1.686 | -0.144 | -0.761 | 2.303 |
| 92.49721085905541 | 1.707 | -0.082 | -0.761 | 2.324 |
| 92.66455931573077 | 1.728 | -0.062 | -0.782 | 2.345 |
| 92.83190777240611 | 1.728 | -0.082 | -0.802 | 2.345 |
| 92.99925622908145 | 1.707 | -0.123 | -0.782 | 2.324 |
| 93.1666046857568 | 1.707 | -0.123 | -0.761 | 2.324 |
| 93.33395314243214 | 1.728 | -0.082 | -0.761 | 2.345 |
| 93.50130159910749 | 1.728 | -0.062 | -0.782 | 2.365 |
| 93.66865005578283 | 1.707 | -0.082 | -0.802 | 2.345 |
| 93.83599851245818 | 1.707 | -0.123 | -0.802 | 2.345 |
| 94.00334696913353 | 1.686 | -0.144 | -0.782 | 2.324 |
| 94.17069542580886 | 1.686 | -0.144 | -0.782 | 2.324 |
| 94.3380438824842 | 1.707 | -0.123 | -0.782 | 2.345 |
| 94.50539233915954 | 1.728 | -0.082 | -0.802 | 2.365 |
| 94.66344365935292 | 1.707 | -0.123 | -0.802 | 2.365 |
| 94.83079211602828 | 1.707 | -0.144 | -0.802 | 2.345 |
| 94.99814057270362 | 1.686 | -0.144 | -0.782 | 2.345 |
| 95.16548902937897 | 1.707 | -0.103 | -0.802 | 2.345 |
| 95.33283748605432 | 1.686 | -0.123 | -0.802 | 2.345 |
| 95.50018594272963 | 1.686 | -0.144 | -0.823 | 2.345 |
| 95.66753439940499 | 1.666 | -0.206 | -0.823 | 2.324 |
| 95.83488285608034 | 1.625 | -0.226 | -0.802 | 2.283 |
| 96.00223131275567 | 1.625 | -0.185 | -0.802 | 2.303 |
| 96.16957976943102 | 1.645 | -0.165 | -0.823 | 2.303 |
| 96.33692822610638 | 1.645 | -0.185 | -0.843 | 2.303 |
| 96.50427668278171 | 1.625 | -0.206 | -0.843 | 2.283 |
| 96.67162513945706 | 1.625 | -0.226 | -0.823 | 2.283 |
| 96.8389735961324 | 1.625 | -0.206 | -0.823 | 2.283 |
| 96.99702491632577 | 1.625 | -0.165 | -0.843 | 2.303 |
| 97.16437337300111 | 1.645 | -0.165 | -0.864 | 2.324 |
| 97.33172182967647 | 1.625 | -0.185 | -0.864 | 2.303 |
| 97.49907028635181 | 1.625 | -0.226 | -0.864 | 2.303 |
| 97.66641874302715 | 1.645 | -0.247 | -0.843 | 2.303 |
| 97.8337671997025 | 1.666 | -0.206 | -0.843 | 2.324 |
| 98.00111565637785 | 1.686 | -0.144 | -0.864 | 2.365 |
| 98.16846411305319 | 1.666 | -0.165 | -0.884 | 2.365 |
| 98.33581256972855 | 1.666 | -0.206 | -0.864 | 2.345 |
| 98.50316102640389 | 1.666 | -0.206 | -0.864 | 2.345 |
| 98.67050948307921 | 1.686 | -0.185 | -0.864 | 2.365 |
| 98.83785793975456 | 1.707 | -0.165 | -0.864 | 2.386 |
| 99.0052063964299 | 1.728 | -0.165 | -0.884 | 2.406 |
| 99.17255485310525 | 1.707 | -0.185 | -0.905 | 2.386 |
| 99.33060617329863 | 1.707 | -0.206 | -0.905 | 2.386 |
| 99.49795462997399 | 1.728 | -0.226 | -0.905 | 2.386 |
| 99.66530308664933 | 1.728 | -0.206 | -0.905 | 2.406 |
| 99.83265154332467 | 1.748 | -0.206 | -0.905 | 2.427 |
| 100.0 | 1.748 | -0.206 | -0.905 | 2.447 |